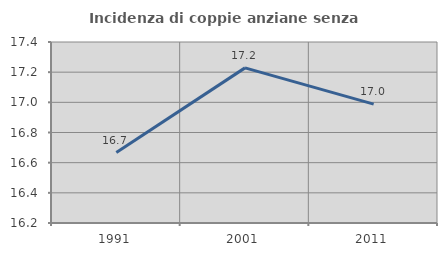
| Category | Incidenza di coppie anziane senza figli  |
|---|---|
| 1991.0 | 16.667 |
| 2001.0 | 17.228 |
| 2011.0 | 16.988 |